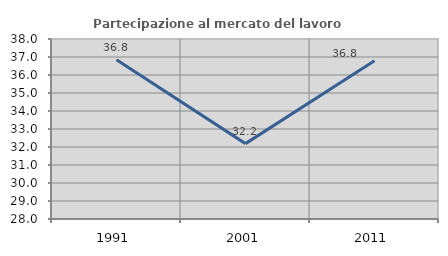
| Category | Partecipazione al mercato del lavoro  femminile |
|---|---|
| 1991.0 | 36.843 |
| 2001.0 | 32.187 |
| 2011.0 | 36.791 |